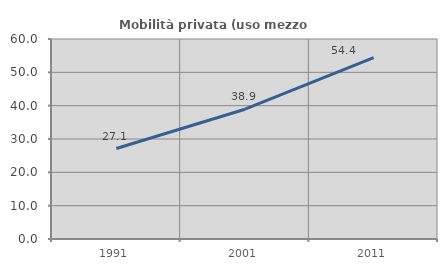
| Category | Mobilità privata (uso mezzo privato) |
|---|---|
| 1991.0 | 27.149 |
| 2001.0 | 38.937 |
| 2011.0 | 54.433 |